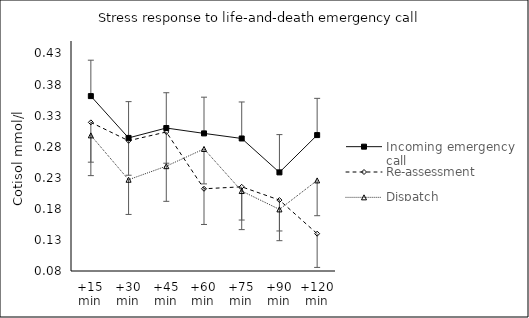
| Category | Incoming emergency call | Re-assessment | Dispatch |
|---|---|---|---|
| +15 min | 0.361 | 0.319 | 0.298 |
| +30 min | 0.294 | 0.29 | 0.227 |
| +45 min | 0.31 | 0.304 | 0.249 |
| +60 min | 0.301 | 0.212 | 0.276 |
| +75 min | 0.293 | 0.215 | 0.209 |
| +90 min | 0.239 | 0.194 | 0.179 |
| +120 min | 0.299 | 0.14 | 0.226 |